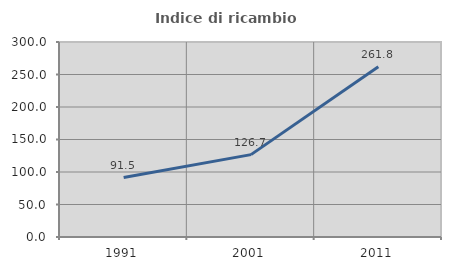
| Category | Indice di ricambio occupazionale  |
|---|---|
| 1991.0 | 91.536 |
| 2001.0 | 126.744 |
| 2011.0 | 261.798 |